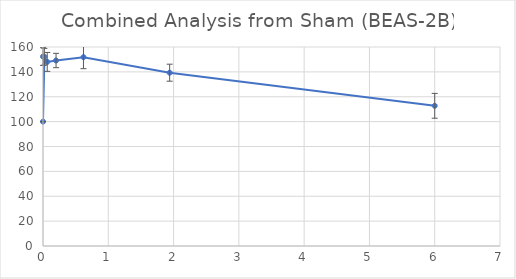
| Category | Combined Analysis from Sham (BEAS-2B) |
|---|---|
| 6.0 | 112.722 |
| 1.94 | 139.34 |
| 0.62 | 151.805 |
| 0.2 | 149.143 |
| 0.065 | 148.018 |
| 0.021 | 152.205 |
| 0.0 | 100 |
| 0.0 | 152.326 |